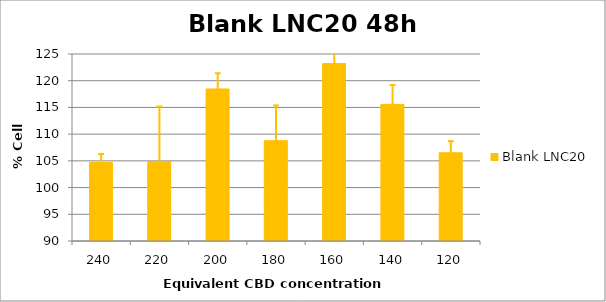
| Category | Blank LNC20 |
|---|---|
| 240.0 | 104.711 |
| 220.0 | 104.883 |
| 200.0 | 118.457 |
| 180.0 | 108.776 |
| 160.0 | 123.202 |
| 140.0 | 115.571 |
| 120.0 | 106.513 |